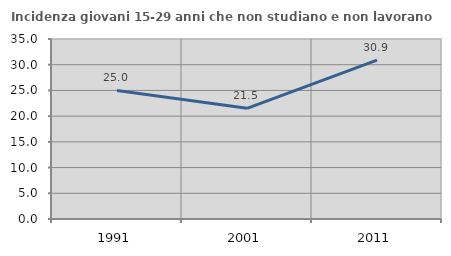
| Category | Incidenza giovani 15-29 anni che non studiano e non lavorano  |
|---|---|
| 1991.0 | 25 |
| 2001.0 | 21.519 |
| 2011.0 | 30.882 |